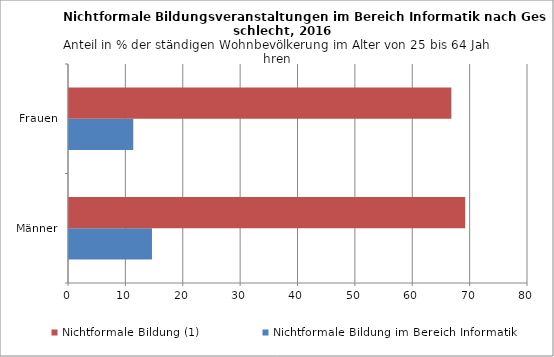
| Category | Nichtformale Bildung im Bereich Informatik | Nichtformale Bildung (1) |
|---|---|---|
| Männer | 14.46 | 69.062 |
| Frauen | 11.201 | 66.645 |